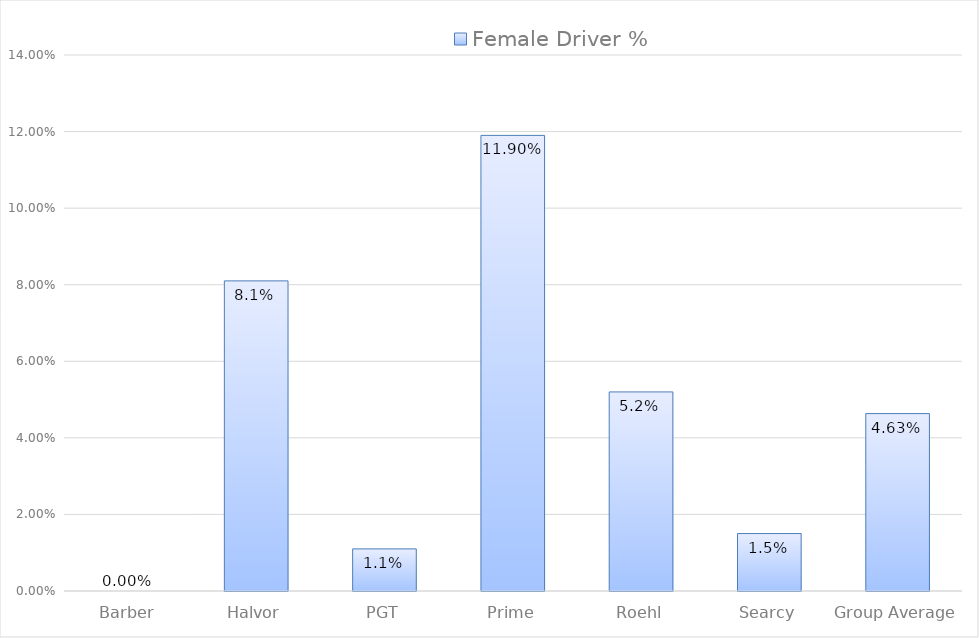
| Category | Female Driver % |
|---|---|
| Barber | 0 |
| Halvor | 0.081 |
| PGT | 0.011 |
| Prime | 0.119 |
| Roehl | 0.052 |
| Searcy | 0.015 |
| Group Average | 0.046 |